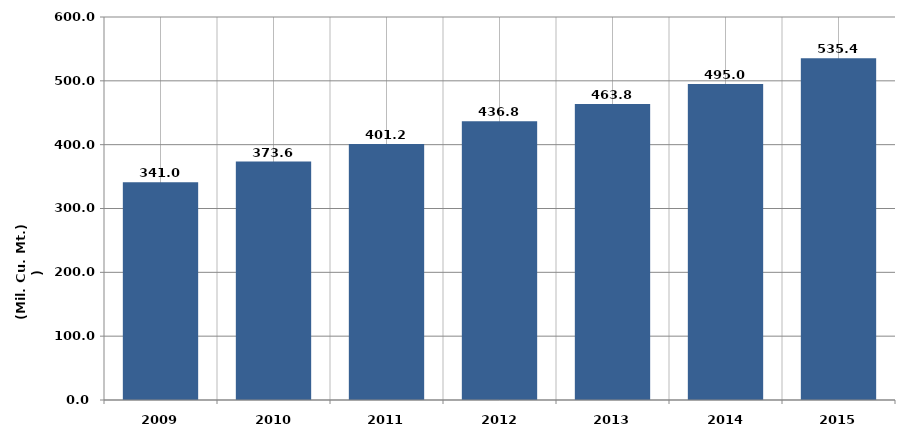
| Category |  انتاج المياه 
( مليون متر مكعب  ) Water Production
(Million Cubic Meters) |
|---|---|
| 2009 | 341 |
| 2010 | 373.6 |
| 2011 | 401.2 |
| 2012 | 436.8 |
| 2013 | 463.8 |
| 2014 | 494.961 |
| 2015 | 535.4 |